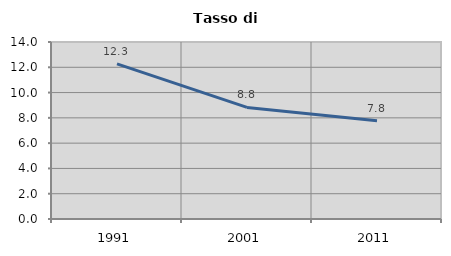
| Category | Tasso di disoccupazione   |
|---|---|
| 1991.0 | 12.264 |
| 2001.0 | 8.824 |
| 2011.0 | 7.774 |